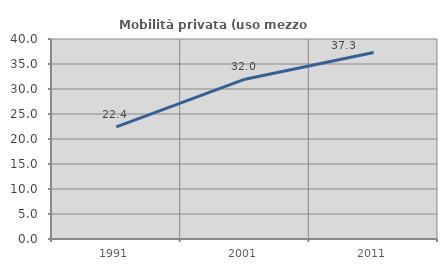
| Category | Mobilità privata (uso mezzo privato) |
|---|---|
| 1991.0 | 22.432 |
| 2001.0 | 31.962 |
| 2011.0 | 37.295 |